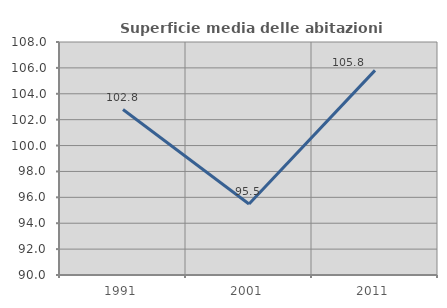
| Category | Superficie media delle abitazioni occupate |
|---|---|
| 1991.0 | 102.785 |
| 2001.0 | 95.488 |
| 2011.0 | 105.808 |